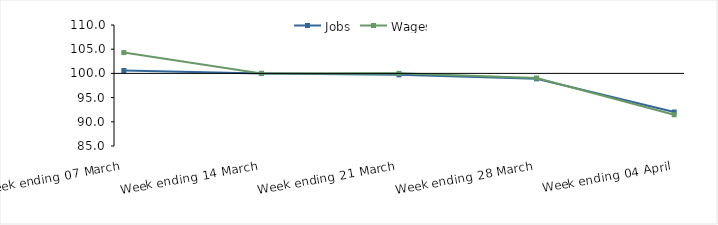
| Category | Jobs | Wages |
|---|---|---|
| 0 | 100.599 | 104.3 |
| 1900-01-01 | 100 | 100 |
| 1900-01-02 | 99.702 | 100.008 |
| 1900-01-03 | 98.883 | 99.049 |
| 1900-01-04 | 92.022 | 91.466 |